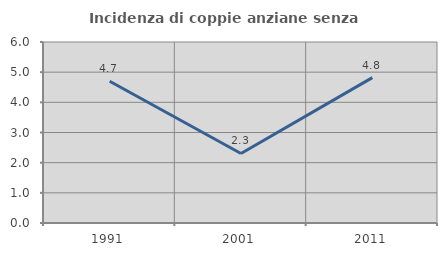
| Category | Incidenza di coppie anziane senza figli  |
|---|---|
| 1991.0 | 4.701 |
| 2001.0 | 2.305 |
| 2011.0 | 4.819 |